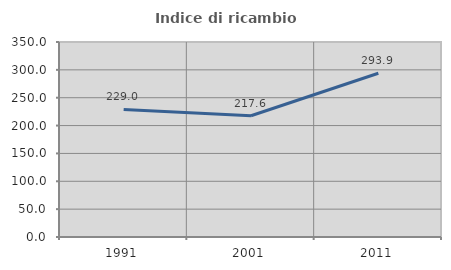
| Category | Indice di ricambio occupazionale  |
|---|---|
| 1991.0 | 229.032 |
| 2001.0 | 217.647 |
| 2011.0 | 293.939 |